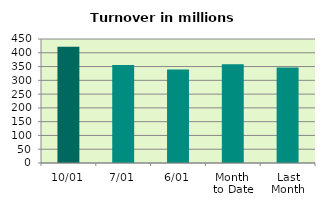
| Category | Series 0 |
|---|---|
| 10/01 | 422.061 |
| 7/01 | 355.817 |
| 6/01 | 339.309 |
| Month 
to Date | 358.306 |
| Last
Month | 346.191 |